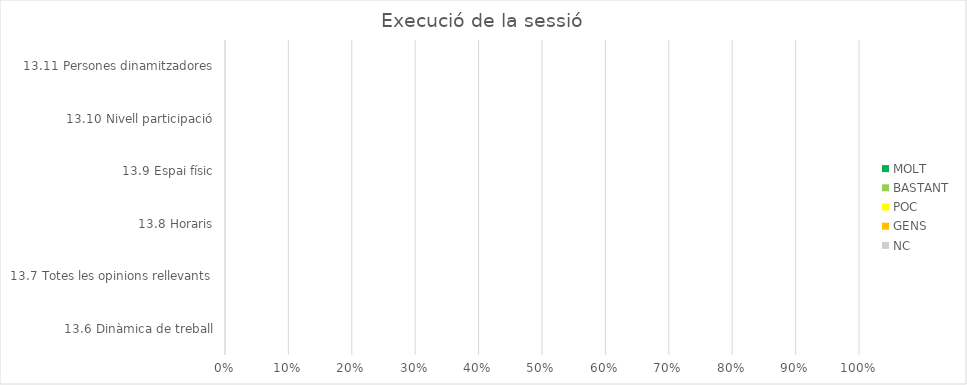
| Category | MOLT | BASTANT | POC | GENS | NC |
|---|---|---|---|---|---|
| 13.6 Dinàmica de treball | 0 | 0 | 0 | 0 | 0 |
| 13.7 Totes les opinions rellevants | 0 | 0 | 0 | 0 | 0 |
| 13.8 Horaris | 0 | 0 | 0 | 0 | 0 |
| 13.9 Espai físic | 0 | 0 | 0 | 0 | 0 |
| 13.10 Nivell participació | 0 | 0 | 0 | 0 | 0 |
| 13.11 Persones dinamitzadores | 0 | 0 | 0 | 0 | 0 |